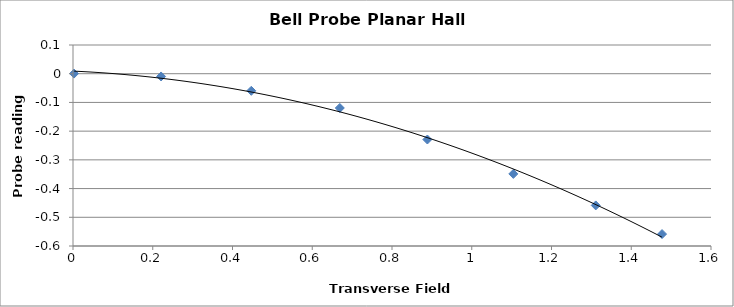
| Category | Series 0 |
|---|---|
| 1.4772500000000002 | -0.558 |
| 1.311 | -0.459 |
| 1.1042999999999998 | -0.349 |
| 0.8887499999999999 | -0.229 |
| 0.6691 | -0.119 |
| 0.4471 | -0.059 |
| 0.22089999999999999 | -0.01 |
| 0.0026 | 0 |